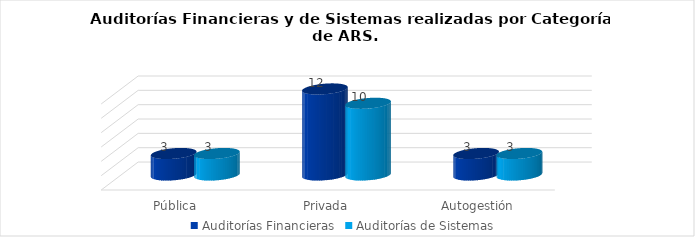
| Category | Auditorías Financieras | Auditorías de Sistemas |
|---|---|---|
| Pública | 3 | 3 |
| Privada | 12 | 10 |
| Autogestión | 3 | 3 |